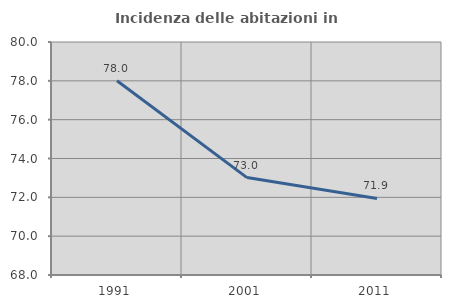
| Category | Incidenza delle abitazioni in proprietà  |
|---|---|
| 1991.0 | 78.006 |
| 2001.0 | 73.017 |
| 2011.0 | 71.94 |